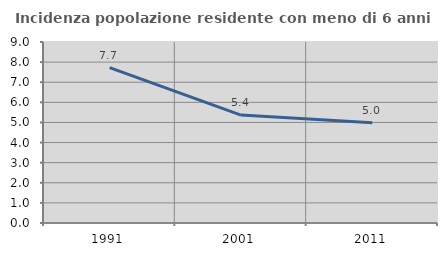
| Category | Incidenza popolazione residente con meno di 6 anni |
|---|---|
| 1991.0 | 7.723 |
| 2001.0 | 5.367 |
| 2011.0 | 4.987 |